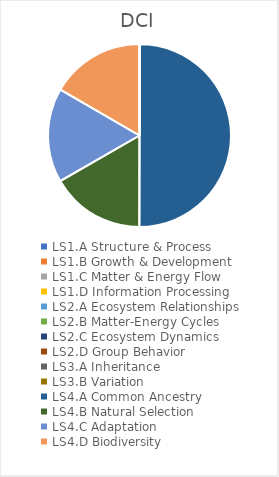
| Category | DCI |
|---|---|
| LS1.A Structure & Process | 0 |
| LS1.B Growth & Development | 0 |
| LS1.C Matter & Energy Flow | 0 |
| LS1.D Information Processing | 0 |
| LS2.A Ecosystem Relationships | 0 |
| LS2.B Matter-Energy Cycles | 0 |
| LS2.C Ecosystem Dynamics | 0 |
| LS2.D Group Behavior | 0 |
| LS3.A Inheritance | 0 |
| LS3.B Variation | 0 |
| LS4.A Common Ancestry | 0.5 |
| LS4.B Natural Selection | 0.167 |
| LS4.C Adaptation | 0.167 |
| LS4.D Biodiversity | 0.167 |